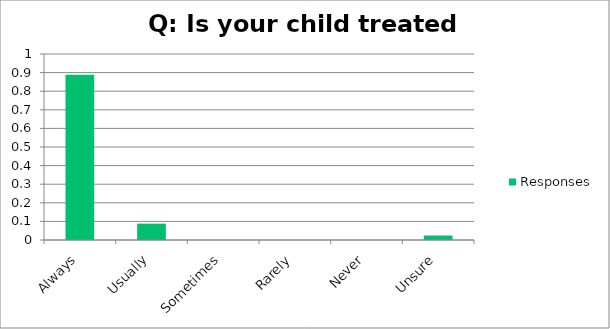
| Category | Responses |
|---|---|
| Always | 0.888 |
| Usually | 0.088 |
| Sometimes | 0 |
| Rarely | 0 |
| Never | 0 |
| Unsure | 0.024 |